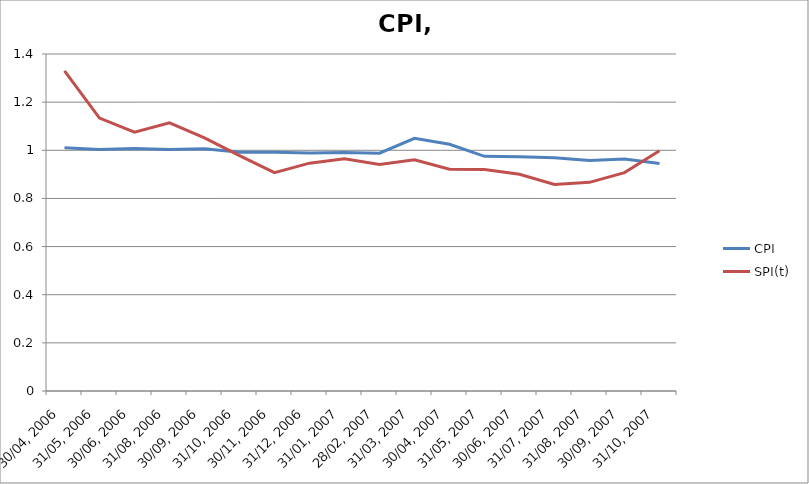
| Category | CPI | SPI(t) |
|---|---|---|
| 30/04, 2006 | 1.011 | 1.33 |
| 31/05, 2006 | 1.004 | 1.134 |
| 30/06, 2006 | 1.008 | 1.075 |
| 31/08, 2006 | 1.004 | 1.114 |
| 30/09, 2006 | 1.007 | 1.052 |
| 31/10, 2006 | 0.992 | 0.978 |
| 30/11, 2006 | 0.992 | 0.907 |
| 31/12, 2006 | 0.989 | 0.947 |
| 31/01, 2007 | 0.991 | 0.964 |
| 28/02, 2007 | 0.988 | 0.941 |
| 31/03, 2007 | 1.05 | 0.96 |
| 30/04, 2007 | 1.025 | 0.921 |
| 31/05, 2007 | 0.975 | 0.92 |
| 30/06, 2007 | 0.973 | 0.9 |
| 31/07, 2007 | 0.969 | 0.858 |
| 31/08, 2007 | 0.958 | 0.867 |
| 30/09, 2007 | 0.964 | 0.907 |
| 31/10, 2007 | 0.945 | 0.998 |